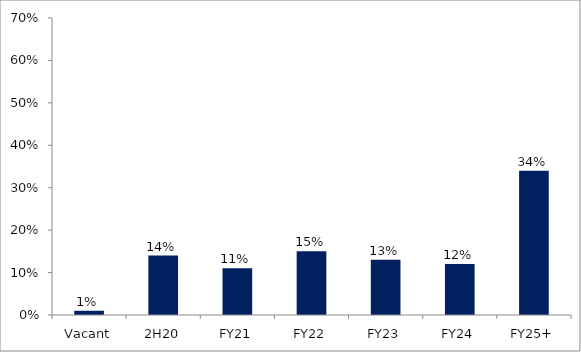
| Category | Series 0 |
|---|---|
| Vacant | 0.01 |
| 2H20 | 0.14 |
| FY21 | 0.11 |
| FY22 | 0.15 |
| FY23 | 0.13 |
| FY24 | 0.12 |
| FY25+ | 0.34 |